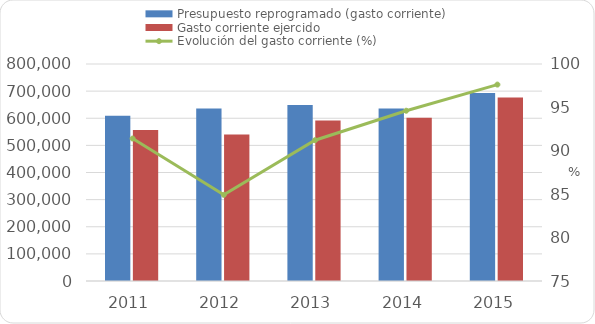
| Category | Presupuesto reprogramado (gasto corriente) | Gasto corriente ejercido |
|---|---|---|
| 2011 | 609286 | 556962 |
| 2012 | 635864.8 | 540007.3 |
| 2013 | 648900.7 | 591915.7 |
| 2014 | 636228.2 | 601977.4 |
| 2015 | 692840.462 | 676403.338 |